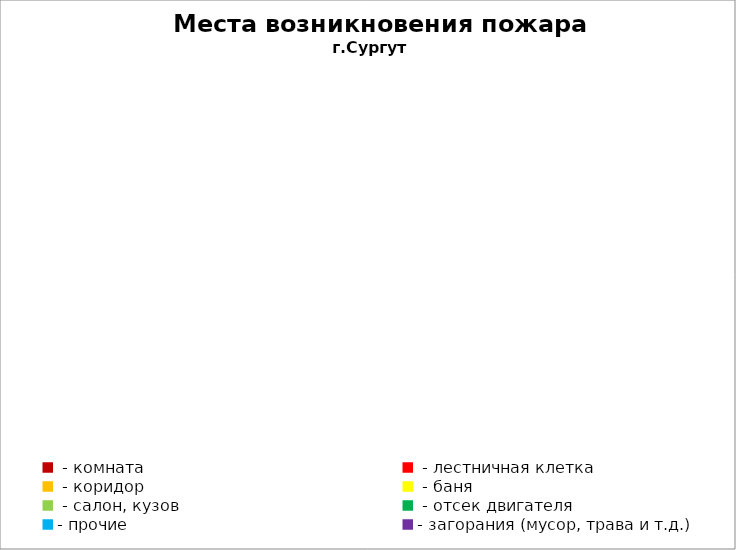
| Category | Места возникновения пожара |
|---|---|
|  - комната | 15 |
|  - лестничная клетка | 1 |
|  - коридор | 5 |
|  - баня | 3 |
|  - салон, кузов | 3 |
|  - отсек двигателя | 20 |
| - прочие | 52 |
| - загорания (мусор, трава и т.д.)  | 20 |